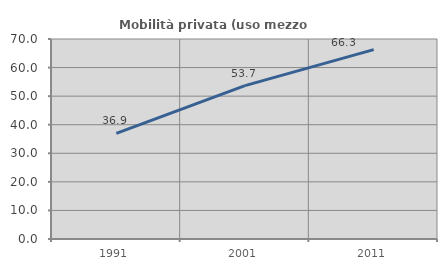
| Category | Mobilità privata (uso mezzo privato) |
|---|---|
| 1991.0 | 36.937 |
| 2001.0 | 53.696 |
| 2011.0 | 66.274 |